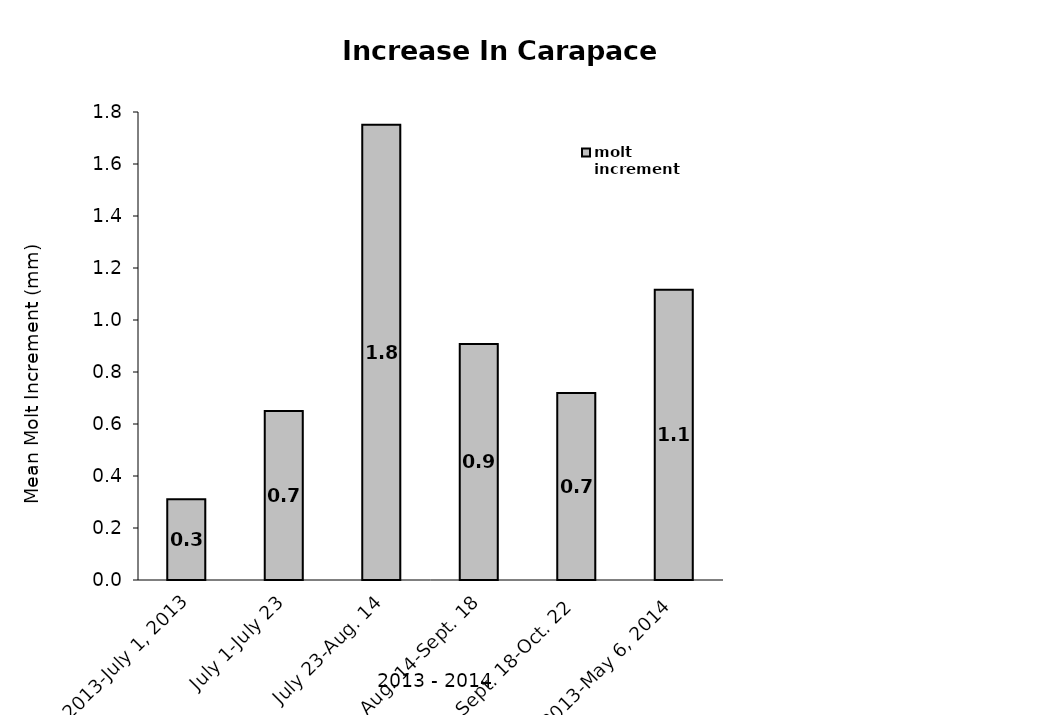
| Category | molt increment  |
|---|---|
|   June 3, 2013-July 1, 2013 | 0.311 |
| July 1-July 23 | 0.65 |
| July 23-Aug. 14 | 1.751 |
| Aug. 14-Sept. 18 | 0.908 |
| Sept. 18-Oct. 22 | 0.719 |
| Oct. 22, 2013-May 6, 2014 | 1.116 |